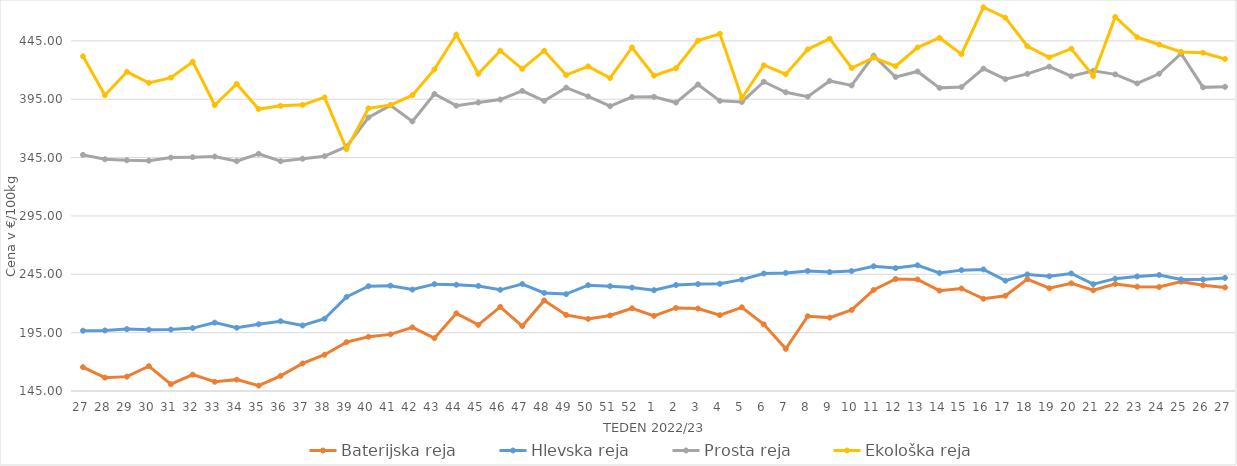
| Category | Baterijska reja | Hlevska reja | Prosta reja | Ekološka reja |
|---|---|---|---|---|
| 27.0 | 165.45 | 196.64 | 347.3 | 431.72 |
| 28.0 | 156.46 | 196.88 | 343.56 | 398.45 |
| 29.0 | 157.31 | 198.03 | 342.71 | 418.45 |
| 30.0 | 166.29 | 197.55 | 342.35 | 408.97 |
| 31.0 | 150.81 | 197.66 | 344.97 | 413.45 |
| 32.0 | 158.99 | 198.9 | 345.35 | 427.07 |
| 33.0 | 152.91 | 203.57 | 345.9 | 390 |
| 34.0 | 154.73 | 199.17 | 341.92 | 408.1 |
| 35.0 | 149.6 | 202.21 | 348.2 | 386.55 |
| 36.0 | 157.93 | 204.81 | 341.85 | 389.31 |
| 37.0 | 168.61 | 201.11 | 343.97 | 390.17 |
| 38.0 | 176.07 | 206.91 | 346.16 | 396.55 |
| 39.0 | 186.86 | 225.6 | 354.41 | 352.24 |
| 40.0 | 191.45 | 234.79 | 379.35 | 387.24 |
| 41.0 | 193.52 | 235.24 | 389.75 | 390 |
| 42.0 | 199.51 | 231.92 | 376.02 | 398.45 |
| 43.0 | 190.28 | 236.56 | 399.51 | 420.52 |
| 44.0 | 211.53 | 236.04 | 389.44 | 450.35 |
| 45.0 | 201.69 | 235.01 | 392.15 | 416.72 |
| 46.0 | 217.08 | 231.68 | 394.71 | 436.55 |
| 47.0 | 200.62 | 236.65 | 402.12 | 421.03 |
| 48.0 | 222.61 | 229.05 | 393.56 | 436.55 |
| 49.0 | 210.16 | 228.03 | 404.87 | 415.69 |
| 50.0 | 206.76 | 235.63 | 397.4 | 423.1 |
| 51.0 | 209.69 | 234.79 | 389.05 | 413.1 |
| 52.0 | 215.87 | 233.58 | 396.87 | 439.31 |
| 1.0 | 209.37 | 231.41 | 397.04 | 415.17 |
| 2.0 | 216.15 | 235.78 | 392.13 | 421.55 |
| 3.0 | 215.63 | 236.58 | 407.61 | 445.17 |
| 4.0 | 210 | 236.85 | 393.58 | 451.04 |
| 5.0 | 216.7 | 240.42 | 392.67 | 396.03 |
| 6.0 | 202.1 | 245.67 | 409.97 | 424.14 |
| 7.0 | 181.11 | 246.12 | 400.94 | 416.38 |
| 8.0 | 209.08 | 247.88 | 397.11 | 437.76 |
| 9.0 | 207.87 | 246.89 | 410.64 | 446.9 |
| 10.0 | 214.42 | 247.73 | 406.8 | 421.72 |
| 11.0 | 231.56 | 251.88 | 432.34 | 430.69 |
| 12.0 | 240.97 | 250.3 | 414 | 423.28 |
| 13.0 | 240.55 | 252.7 | 418.74 | 439.31 |
| 14.0 | 230.99 | 246.12 | 404.72 | 447.59 |
| 15.0 | 232.82 | 248.56 | 405.42 | 433.62 |
| 16.0 | 224 | 249.17 | 421.22 | 473.79 |
| 17.0 | 226.57 | 239.5 | 412.13 | 464.83 |
| 18.0 | 240.83 | 244.89 | 416.74 | 440.35 |
| 19.0 | 233.05 | 243.26 | 422.93 | 430.86 |
| 20.0 | 237.25 | 245.73 | 414.68 | 438.28 |
| 21.0 | 231.3 | 236.5 | 419.36 | 414.83 |
| 22.0 | 236.67 | 241.27 | 416.27 | 465.52 |
| 23.0 | 234.39 | 243.16 | 408.53 | 448.1 |
| 24.0 | 234.08 | 244.37 | 416.78 | 441.9 |
| 25.0 | 238.69 | 240.6 | 434.05 | 435.52 |
| 26.0 | 235.57 | 240.51 | 405.15 | 434.83 |
| 27.0 | 233.75 | 241.89 | 405.58 | 429.48 |